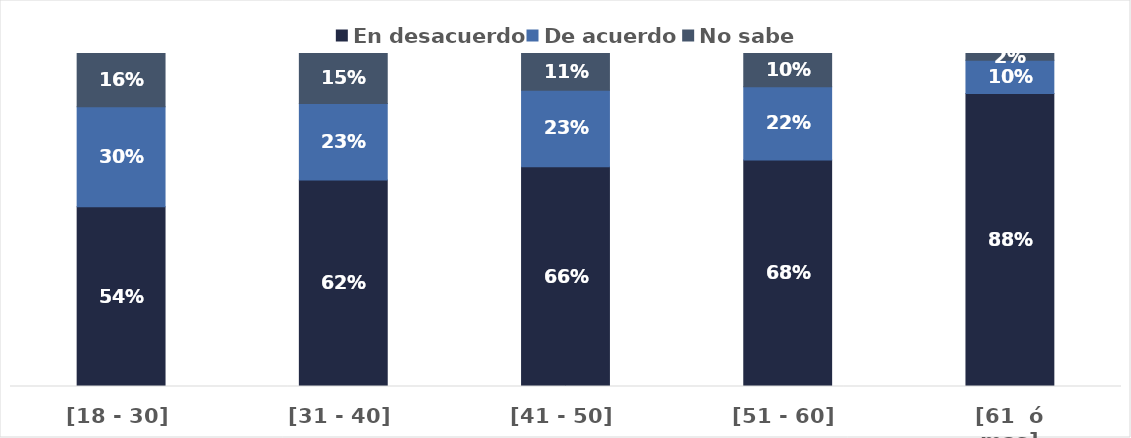
| Category | En desacuerdo | De acuerdo | No sabe |
|---|---|---|---|
| [18 - 30] | 0.54 | 0.3 | 0.16 |
| [31 - 40] | 0.62 | 0.23 | 0.15 |
| [41 - 50] | 0.66 | 0.23 | 0.11 |
| [51 - 60] | 0.68 | 0.22 | 0.1 |
| [61  ó mas] | 0.88 | 0.1 | 0.02 |